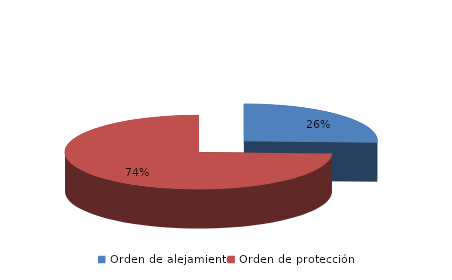
| Category | Series 0 |
|---|---|
| Orden de alejamiento | 282 |
| Orden de protección | 819 |